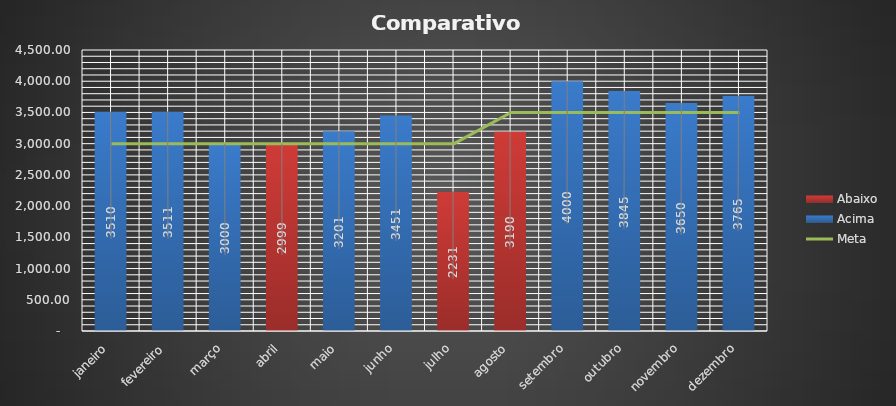
| Category | Acima | Abaixo |
|---|---|---|
| janeiro | 3510.4 | 0 |
| fevereiro | 3510.7 | 0 |
| março | 3000 | 0 |
| abril | 0 | 2998.55 |
| maio | 3200.65 | 0 |
| junho | 3450.99 | 0 |
| julho | 0 | 2230.99 |
| agosto | 0 | 3190.45 |
| setembro | 4000.05 | 0 |
| outubro | 3845 | 0 |
| novembro | 3650 | 0 |
| dezembro | 3765.4 | 0 |